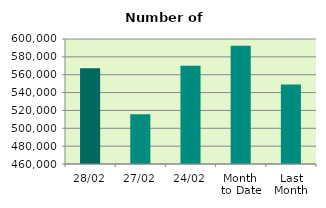
| Category | Series 0 |
|---|---|
| 28/02 | 567202 |
| 27/02 | 515586 |
| 24/02 | 570062 |
| Month 
to Date | 592303 |
| Last
Month | 549126.273 |